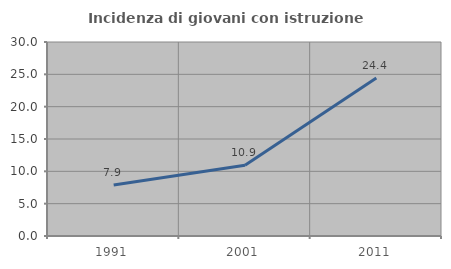
| Category | Incidenza di giovani con istruzione universitaria |
|---|---|
| 1991.0 | 7.874 |
| 2001.0 | 10.929 |
| 2011.0 | 24.444 |